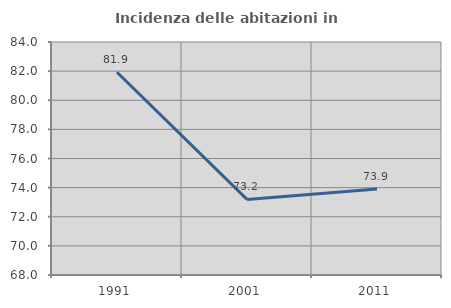
| Category | Incidenza delle abitazioni in proprietà  |
|---|---|
| 1991.0 | 81.921 |
| 2001.0 | 73.192 |
| 2011.0 | 73.905 |